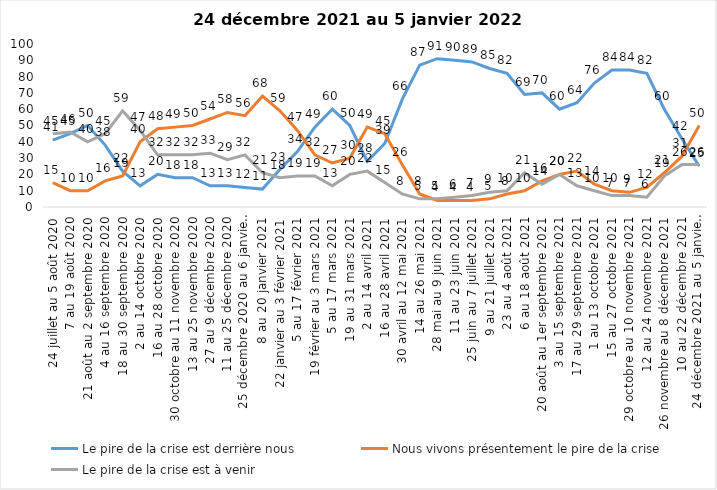
| Category | Le pire de la crise est derrière nous | Nous vivons présentement le pire de la crise | Le pire de la crise est à venir |
|---|---|---|---|
| 24 juillet au 5 août 2020 | 41 | 15 | 45 |
| 7 au 19 août 2020 | 45 | 10 | 46 |
| 21 août au 2 septembre 2020 | 50 | 10 | 40 |
| 4 au 16 septembre 2020 | 38 | 16 | 45 |
| 18 au 30 septembre 2020 | 22 | 19 | 59 |
| 2 au 14 octobre 2020 | 13 | 40 | 47 |
| 16 au 28 octobre 2020 | 20 | 48 | 32 |
| 30 octobre au 11 novembre 2020 | 18 | 49 | 32 |
| 13 au 25 novembre 2020 | 18 | 50 | 32 |
| 27 au 9 décembre 2020 | 13 | 54 | 33 |
| 11 au 25 décembre 2020 | 13 | 58 | 29 |
| 25 décembre 2020 au 6 janvier 2021 | 12 | 56 | 32 |
| 8 au 20 janvier 2021 | 11 | 68 | 21 |
| 22 janvier au 3 février 2021 | 23 | 59 | 18 |
| 5 au 17 février 2021 | 34 | 47 | 19 |
| 19 février au 3 mars 2021 | 49 | 32 | 19 |
| 5 au 17 mars 2021 | 60 | 27 | 13 |
| 19 au 31 mars 2021 | 50 | 30 | 20 |
| 2 au 14 avril 2021 | 28 | 49 | 22 |
| 16 au 28 avril 2021 | 39 | 45 | 15 |
| 30 avril au 12 mai 2021 | 66 | 26 | 8 |
| 14 au 26 mai 2021 | 87 | 8 | 5 |
| 28 mai au 9 juin 2021 | 91 | 4 | 5 |
| 11 au 23 juin 2021 | 90 | 4 | 6 |
| 25 juin au 7 juillet 2021 | 89 | 4 | 7 |
| 9 au 21 juillet 2021 | 85 | 5 | 9 |
| 23 au 4 août 2021 | 82 | 8 | 10 |
| 6 au 18 août 2021 | 69 | 10 | 21 |
| 20 août au 1er septembre 2021 | 70 | 16 | 14 |
| 3 au 15 septembre 2021 | 60 | 20 | 20 |
| 17 au 29 septembre 2021 | 64 | 22 | 13 |
| 1 au 13 octobre 2021 | 76 | 14 | 10 |
| 15 au 27 octobre 2021 | 84 | 10 | 7 |
| 29 octobre au 10 novembre 2021 | 84 | 9 | 7 |
| 12 au 24 novembre 2021 | 82 | 12 | 6 |
| 26 novembre au 8 décembre 2021 | 60 | 21 | 19 |
| 10 au 22 décembre 2021 | 42 | 31 | 26 |
| 24 décembre 2021 au 5 janvier 2022 2022 | 25 | 50 | 26 |